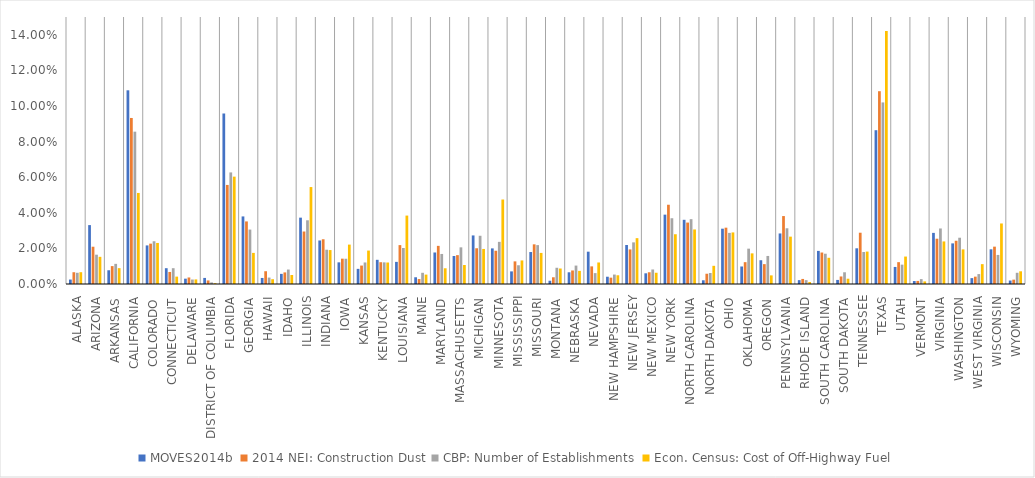
| Category | MOVES2014b | 2014 NEI: Construction Dust | CBP: Number of Establishments | Econ. Census: Cost of Off-Highway Fuel |
|---|---|---|---|---|
| ALASKA | 0.003 | 0.007 | 0.006 | 0.007 |
| ARIZONA | 0.033 | 0.021 | 0.016 | 0.015 |
| ARKANSAS | 0.008 | 0.01 | 0.011 | 0.009 |
| CALIFORNIA | 0.109 | 0.093 | 0.086 | 0.051 |
| COLORADO | 0.022 | 0.023 | 0.024 | 0.023 |
| CONNECTICUT | 0.009 | 0.007 | 0.009 | 0.004 |
| DELAWARE | 0.003 | 0.004 | 0.003 | 0.003 |
| DISTRICT OF COLUMBIA | 0.003 | 0.002 | 0.001 | 0 |
| FLORIDA | 0.096 | 0.056 | 0.063 | 0.06 |
| GEORGIA | 0.038 | 0.035 | 0.031 | 0.017 |
| HAWAII | 0.003 | 0.007 | 0.004 | 0.003 |
| IDAHO | 0.006 | 0.007 | 0.008 | 0.005 |
| ILLINOIS | 0.037 | 0.029 | 0.036 | 0.054 |
| INDIANA | 0.024 | 0.025 | 0.019 | 0.019 |
| IOWA | 0.012 | 0.014 | 0.014 | 0.022 |
| KANSAS | 0.009 | 0.01 | 0.012 | 0.019 |
| KENTUCKY | 0.014 | 0.012 | 0.012 | 0.012 |
| LOUISIANA | 0.012 | 0.022 | 0.02 | 0.038 |
| MAINE | 0.004 | 0.003 | 0.006 | 0.005 |
| MARYLAND | 0.018 | 0.021 | 0.017 | 0.009 |
| MASSACHUSETTS | 0.016 | 0.016 | 0.021 | 0.011 |
| MICHIGAN | 0.027 | 0.02 | 0.027 | 0.02 |
| MINNESOTA | 0.02 | 0.019 | 0.024 | 0.047 |
| MISSISSIPPI | 0.007 | 0.013 | 0.011 | 0.013 |
| MISSOURI | 0.018 | 0.022 | 0.022 | 0.017 |
| MONTANA | 0.002 | 0.004 | 0.009 | 0.009 |
| NEBRASKA | 0.007 | 0.008 | 0.01 | 0.007 |
| NEVADA | 0.018 | 0.01 | 0.006 | 0.012 |
| NEW HAMPSHIRE | 0.004 | 0.004 | 0.005 | 0.005 |
| NEW JERSEY | 0.022 | 0.019 | 0.023 | 0.026 |
| NEW MEXICO | 0.006 | 0.007 | 0.008 | 0.006 |
| NEW YORK | 0.039 | 0.045 | 0.037 | 0.028 |
| NORTH CAROLINA | 0.036 | 0.035 | 0.036 | 0.031 |
| NORTH DAKOTA | 0.002 | 0.006 | 0.006 | 0.01 |
| OHIO | 0.031 | 0.032 | 0.029 | 0.029 |
| OKLAHOMA | 0.01 | 0.012 | 0.02 | 0.017 |
| OREGON | 0.013 | 0.011 | 0.016 | 0.005 |
| PENNSYLVANIA | 0.028 | 0.038 | 0.031 | 0.027 |
| RHODE ISLAND | 0.002 | 0.003 | 0.002 | 0.001 |
| SOUTH CAROLINA | 0.019 | 0.018 | 0.017 | 0.015 |
| SOUTH DAKOTA | 0.002 | 0.004 | 0.007 | 0.003 |
| TENNESSEE | 0.02 | 0.029 | 0.018 | 0.018 |
| TEXAS | 0.086 | 0.108 | 0.102 | 0.142 |
| UTAH | 0.01 | 0.012 | 0.011 | 0.015 |
| VERMONT | 0.002 | 0.002 | 0.003 | 0.001 |
| VIRGINIA | 0.029 | 0.025 | 0.031 | 0.024 |
| WASHINGTON | 0.023 | 0.024 | 0.026 | 0.019 |
| WEST VIRGINIA | 0.003 | 0.004 | 0.006 | 0.011 |
| WISCONSIN | 0.019 | 0.021 | 0.016 | 0.034 |
| WYOMING | 0.002 | 0.002 | 0.006 | 0.007 |